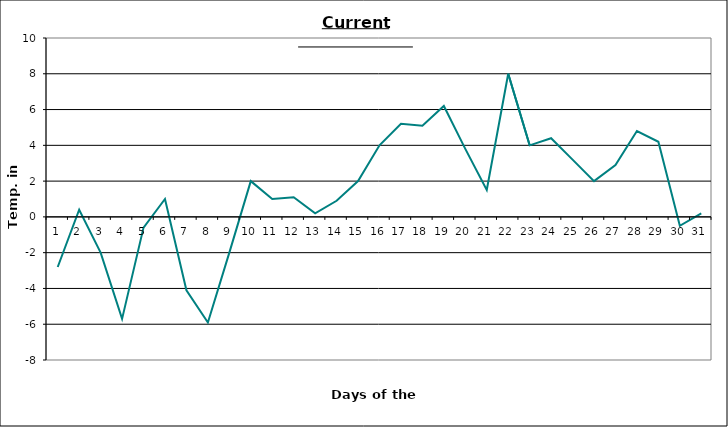
| Category | Series 0 |
|---|---|
| 0 | -2.8 |
| 1 | 0.4 |
| 2 | -2 |
| 3 | -5.7 |
| 4 | -0.6 |
| 5 | 1 |
| 6 | -4.1 |
| 7 | -5.9 |
| 8 | -2 |
| 9 | 2 |
| 10 | 1 |
| 11 | 1.1 |
| 12 | 0.2 |
| 13 | 0.9 |
| 14 | 2 |
| 15 | 4 |
| 16 | 5.2 |
| 17 | 5.1 |
| 18 | 6.2 |
| 19 | 3.8 |
| 20 | 1.5 |
| 21 | 8 |
| 22 | 4 |
| 23 | 4.4 |
| 24 | 3.2 |
| 25 | 2 |
| 26 | 2.9 |
| 27 | 4.8 |
| 28 | 4.2 |
| 29 | -0.5 |
| 30 | 0.2 |